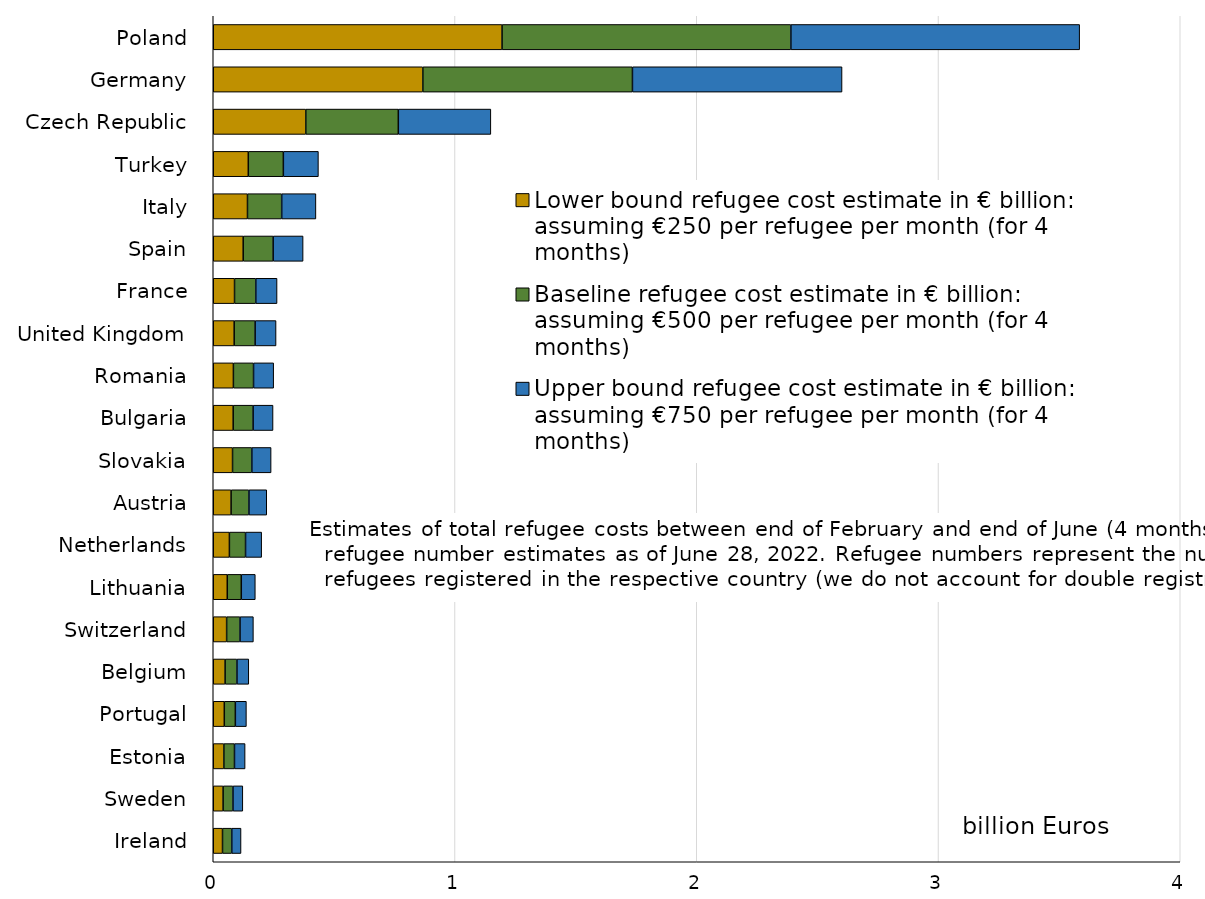
| Category | Lower bound refugee cost estimate in € billion: assuming €250 per refugee per month (for 4 months) | Baseline refugee cost estimate in € billion: assuming €500 per refugee per month (for 4 months) | Upper bound refugee cost estimate in € billion: assuming €750 per refugee per month (for 4 months) |
|---|---|---|---|
| Poland | 1.195 | 1.195 | 1.195 |
| Germany | 0.867 | 0.867 | 0.867 |
| Czech Republic | 0.383 | 0.383 | 0.383 |
| Turkey | 0.145 | 0.145 | 0.145 |
| Italy | 0.142 | 0.142 | 0.142 |
| Spain | 0.124 | 0.124 | 0.124 |
| France | 0.088 | 0.088 | 0.088 |
| United Kingdom | 0.087 | 0.087 | 0.087 |
| Romania | 0.083 | 0.083 | 0.083 |
| Bulgaria | 0.082 | 0.082 | 0.082 |
| Slovakia | 0.08 | 0.08 | 0.08 |
| Austria | 0.074 | 0.074 | 0.074 |
| Netherlands | 0.067 | 0.067 | 0.067 |
| Lithuania | 0.058 | 0.058 | 0.058 |
| Switzerland | 0.055 | 0.055 | 0.055 |
| Belgium | 0.049 | 0.049 | 0.049 |
| Portugal | 0.046 | 0.046 | 0.046 |
| Estonia | 0.044 | 0.044 | 0.044 |
| Sweden | 0.041 | 0.041 | 0.041 |
| Ireland | 0.038 | 0.038 | 0.038 |